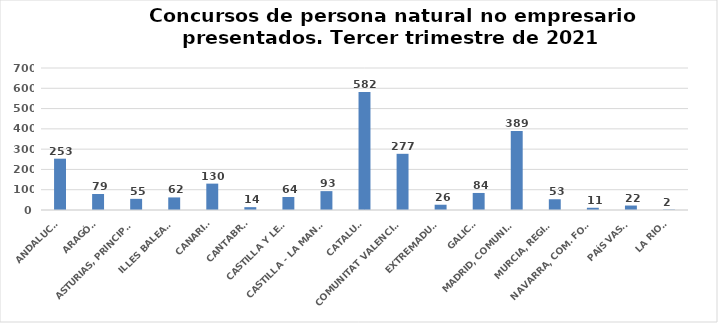
| Category | Series 0 |
|---|---|
| ANDALUCÍA | 253 |
| ARAGÓN | 79 |
| ASTURIAS, PRINCIPADO | 55 |
| ILLES BALEARS | 62 |
| CANARIAS | 130 |
| CANTABRIA | 14 |
| CASTILLA Y LEÓN | 64 |
| CASTILLA - LA MANCHA | 93 |
| CATALUÑA | 582 |
| COMUNITAT VALENCIANA | 277 |
| EXTREMADURA | 26 |
| GALICIA | 84 |
| MADRID, COMUNIDAD | 389 |
| MURCIA, REGIÓN | 53 |
| NAVARRA, COM. FORAL | 11 |
| PAÍS VASCO | 22 |
| LA RIOJA | 2 |